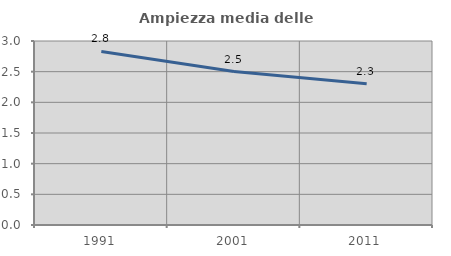
| Category | Ampiezza media delle famiglie |
|---|---|
| 1991.0 | 2.83 |
| 2001.0 | 2.503 |
| 2011.0 | 2.303 |